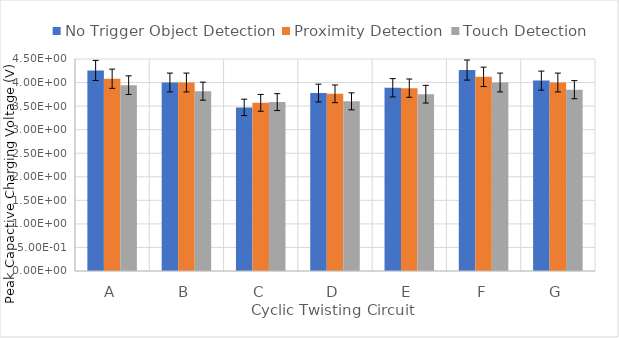
| Category | No Trigger Object Detection | Proximity Detection | Touch Detection |
|---|---|---|---|
| A | 4.257 | 4.081 | 3.945 |
| B | 4.001 | 4.001 | 3.817 |
| C | 3.473 | 3.569 | 3.585 |
| D | 3.777 | 3.761 | 3.601 |
| E | 3.889 | 3.881 | 3.753 |
| F | 4.265 | 4.121 | 4.001 |
| G | 4.041 | 4.001 | 3.849 |